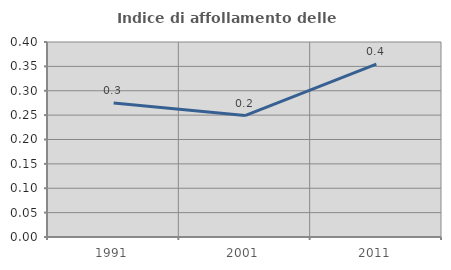
| Category | Indice di affollamento delle abitazioni  |
|---|---|
| 1991.0 | 0.275 |
| 2001.0 | 0.249 |
| 2011.0 | 0.355 |